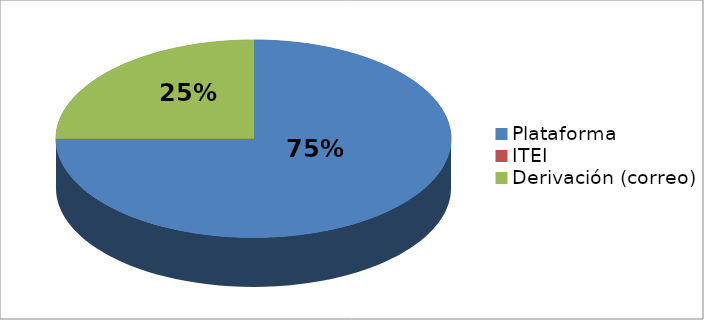
| Category | Series 0 | Series 1 |
|---|---|---|
| Plataforma | 6 | 0.75 |
| ITEI | 0 | 0 |
| Derivación (correo) | 2 | 0.25 |